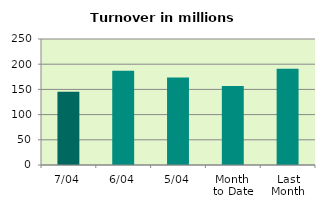
| Category | Series 0 |
|---|---|
| 7/04 | 145.58 |
| 6/04 | 186.801 |
| 5/04 | 173.55 |
| Month 
to Date | 156.557 |
| Last
Month | 190.797 |